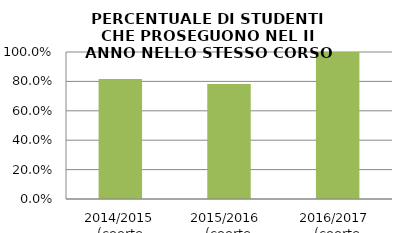
| Category | 2014/2015 (coorte 2013/14) 2015/2016  (coorte 2014/15) 2016/2017  (coorte 2015/16) |
|---|---|
| 2014/2015 (coorte 2013/14) | 0.816 |
| 2015/2016  (coorte 2014/15) | 0.783 |
| 2016/2017  (coorte 2015/16) | 1 |